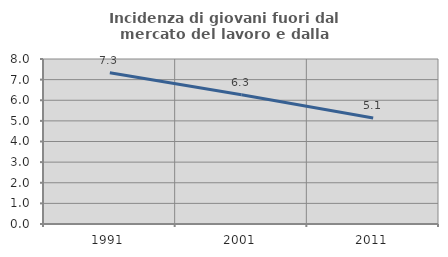
| Category | Incidenza di giovani fuori dal mercato del lavoro e dalla formazione  |
|---|---|
| 1991.0 | 7.331 |
| 2001.0 | 6.271 |
| 2011.0 | 5.14 |